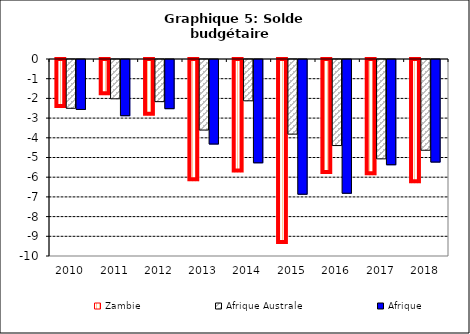
| Category | Zambie | Afrique Australe | Afrique |
|---|---|---|---|
| 2010.0 | -2.432 | -2.477 | -2.535 |
| 2011.0 | -1.783 | -1.995 | -2.853 |
| 2012.0 | -2.832 | -2.14 | -2.495 |
| 2013.0 | -6.151 | -3.581 | -4.291 |
| 2014.0 | -5.705 | -2.096 | -5.245 |
| 2015.0 | -9.338 | -3.788 | -6.84 |
| 2016.0 | -5.781 | -4.368 | -6.79 |
| 2017.0 | -5.844 | -5.043 | -5.342 |
| 2018.0 | -6.262 | -4.606 | -5.208 |